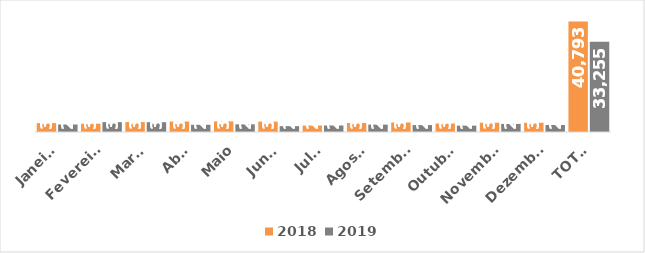
| Category | 2018 | 2019 |
|---|---|---|
| Janeiro | 3274 | 2767 |
| Fevereiro | 3064 | 3638 |
| Março | 3655 | 3612 |
| Abril | 3852 | 2666 |
| Maio | 3910 | 2835 |
| Junho | 3828 | 2154 |
| Julho | 2381 | 2405 |
| Agosto | 3331 | 2725 |
| Setembro | 3520 | 2548 |
| Outubro | 3133 | 2341 |
| Novembro | 3432 | 2980 |
| Dezembro | 3413 | 2584 |